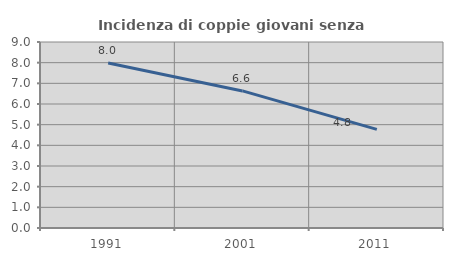
| Category | Incidenza di coppie giovani senza figli |
|---|---|
| 1991.0 | 7.985 |
| 2001.0 | 6.633 |
| 2011.0 | 4.773 |